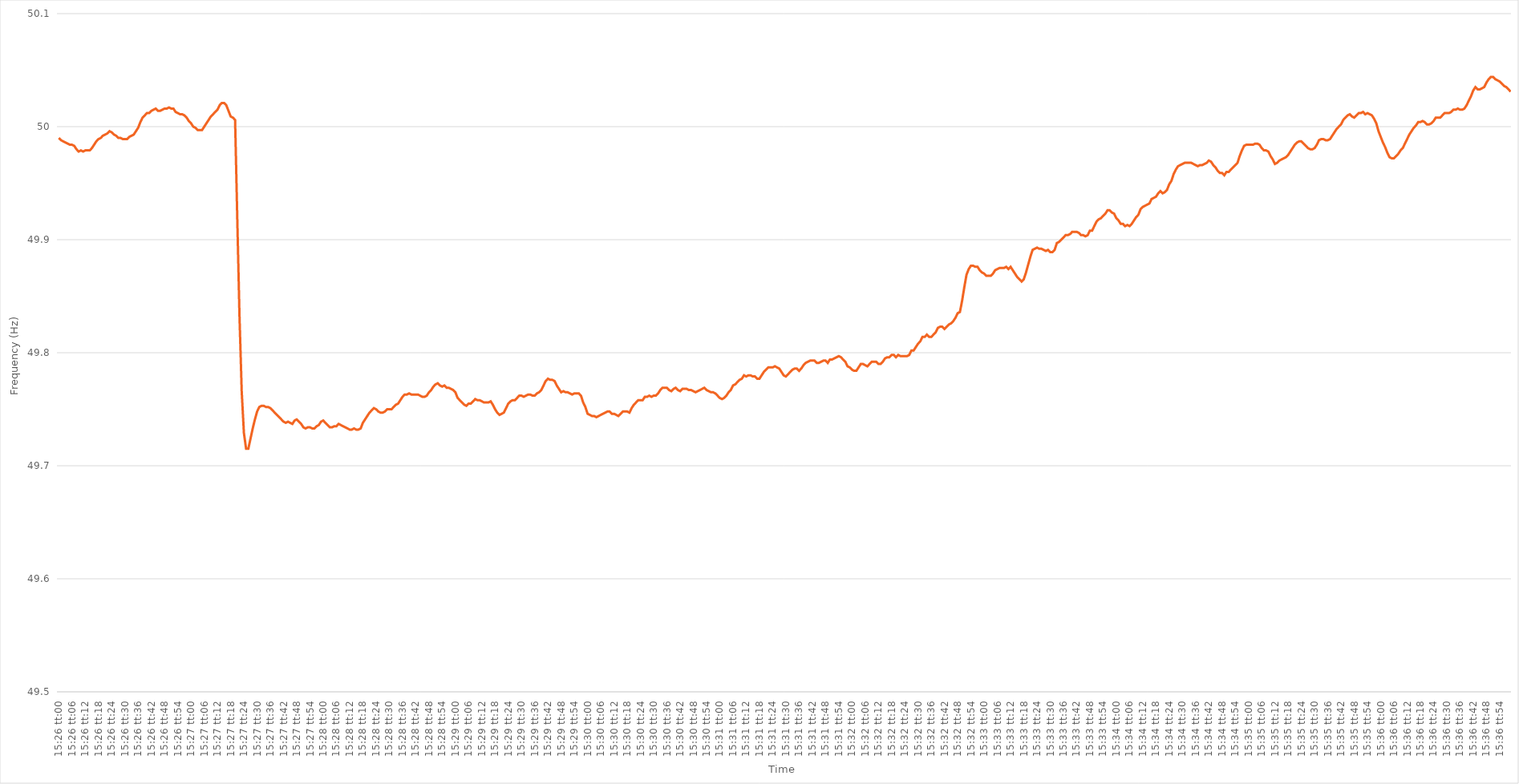
| Category | Series 0 |
|---|---|
| 0.6430555555555556 | 49.99 |
| 0.6430671296296296 | 49.988 |
| 0.6430787037037037 | 49.987 |
| 0.6430902777777777 | 49.986 |
| 0.6431018518518519 | 49.985 |
| 0.6431134259259259 | 49.984 |
| 0.6431250000000001 | 49.984 |
| 0.6431365740740741 | 49.983 |
| 0.6431481481481481 | 49.98 |
| 0.6431597222222222 | 49.978 |
| 0.6431712962962963 | 49.979 |
| 0.6431828703703704 | 49.978 |
| 0.6431944444444445 | 49.979 |
| 0.6432060185185186 | 49.979 |
| 0.6432175925925926 | 49.979 |
| 0.6432291666666666 | 49.981 |
| 0.6432407407407407 | 49.984 |
| 0.6432523148148148 | 49.987 |
| 0.6432638888888889 | 49.989 |
| 0.643275462962963 | 49.99 |
| 0.643287037037037 | 49.992 |
| 0.6432986111111111 | 49.993 |
| 0.6433101851851851 | 49.994 |
| 0.6433217592592593 | 49.996 |
| 0.6433333333333333 | 49.995 |
| 0.6433449074074075 | 49.993 |
| 0.6433564814814815 | 49.992 |
| 0.6433680555555555 | 49.99 |
| 0.6433796296296296 | 49.99 |
| 0.6433912037037037 | 49.989 |
| 0.6434027777777778 | 49.989 |
| 0.6434143518518519 | 49.989 |
| 0.643425925925926 | 49.991 |
| 0.6434375 | 49.992 |
| 0.643449074074074 | 49.993 |
| 0.6434606481481482 | 49.996 |
| 0.6434722222222222 | 49.999 |
| 0.6434837962962963 | 50.004 |
| 0.6434953703703704 | 50.008 |
| 0.6435069444444445 | 50.01 |
| 0.6435185185185185 | 50.012 |
| 0.6435300925925925 | 50.012 |
| 0.6435416666666667 | 50.014 |
| 0.6435532407407407 | 50.015 |
| 0.6435648148148149 | 50.016 |
| 0.6435763888888889 | 50.014 |
| 0.643587962962963 | 50.014 |
| 0.643599537037037 | 50.015 |
| 0.6436111111111111 | 50.016 |
| 0.6436226851851852 | 50.016 |
| 0.6436342592592593 | 50.017 |
| 0.6436458333333334 | 50.016 |
| 0.6436574074074074 | 50.016 |
| 0.6436689814814814 | 50.013 |
| 0.6436805555555556 | 50.012 |
| 0.6436921296296296 | 50.011 |
| 0.6437037037037037 | 50.011 |
| 0.6437152777777778 | 50.01 |
| 0.6437268518518519 | 50.008 |
| 0.6437384259259259 | 50.005 |
| 0.6437499999999999 | 50.003 |
| 0.6437615740740741 | 50 |
| 0.6437731481481481 | 49.999 |
| 0.6437847222222223 | 49.997 |
| 0.6437962962962963 | 49.997 |
| 0.6438078703703703 | 49.997 |
| 0.6438194444444444 | 50 |
| 0.6438310185185185 | 50.003 |
| 0.6438425925925926 | 50.006 |
| 0.6438541666666667 | 50.009 |
| 0.6438657407407408 | 50.011 |
| 0.6438773148148148 | 50.013 |
| 0.6438888888888888 | 50.015 |
| 0.643900462962963 | 50.019 |
| 0.643912037037037 | 50.021 |
| 0.6439236111111112 | 50.021 |
| 0.6439351851851852 | 50.019 |
| 0.6439467592592593 | 50.014 |
| 0.6439583333333333 | 50.009 |
| 0.6439699074074073 | 50.008 |
| 0.6439814814814815 | 50.006 |
| 0.6439930555555555 | 49.918 |
| 0.6440046296296297 | 49.832 |
| 0.6440162037037037 | 49.766 |
| 0.6440277777777778 | 49.729 |
| 0.6440393518518518 | 49.715 |
| 0.6440509259259259 | 49.715 |
| 0.6440625 | 49.724 |
| 0.6440740740740741 | 49.733 |
| 0.6440856481481482 | 49.741 |
| 0.6440972222222222 | 49.748 |
| 0.6441087962962962 | 49.752 |
| 0.6441203703703704 | 49.753 |
| 0.6441319444444444 | 49.753 |
| 0.6441435185185186 | 49.752 |
| 0.6441550925925926 | 49.752 |
| 0.6441666666666667 | 49.751 |
| 0.6441782407407407 | 49.749 |
| 0.6441898148148147 | 49.747 |
| 0.6442013888888889 | 49.745 |
| 0.6442129629629629 | 49.743 |
| 0.6442245370370371 | 49.741 |
| 0.6442361111111111 | 49.739 |
| 0.6442476851851852 | 49.738 |
| 0.6442592592592592 | 49.739 |
| 0.6442708333333333 | 49.738 |
| 0.6442824074074074 | 49.737 |
| 0.6442939814814815 | 49.74 |
| 0.6443055555555556 | 49.741 |
| 0.6443171296296296 | 49.739 |
| 0.6443287037037037 | 49.737 |
| 0.6443402777777778 | 49.734 |
| 0.6443518518518518 | 49.733 |
| 0.644363425925926 | 49.734 |
| 0.644375 | 49.734 |
| 0.6443865740740741 | 49.733 |
| 0.6443981481481481 | 49.733 |
| 0.6444097222222221 | 49.735 |
| 0.6444212962962963 | 49.736 |
| 0.6444328703703703 | 49.739 |
| 0.6444444444444445 | 49.74 |
| 0.6444560185185185 | 49.738 |
| 0.6444675925925926 | 49.736 |
| 0.6444791666666666 | 49.734 |
| 0.6444907407407408 | 49.734 |
| 0.6445023148148148 | 49.735 |
| 0.6445138888888889 | 49.735 |
| 0.644525462962963 | 49.737 |
| 0.644537037037037 | 49.736 |
| 0.6445486111111111 | 49.735 |
| 0.6445601851851852 | 49.734 |
| 0.6445717592592592 | 49.733 |
| 0.6445833333333334 | 49.732 |
| 0.6445949074074074 | 49.732 |
| 0.6446064814814815 | 49.733 |
| 0.6446180555555555 | 49.732 |
| 0.6446296296296297 | 49.732 |
| 0.6446412037037037 | 49.733 |
| 0.6446527777777779 | 49.738 |
| 0.6446643518518519 | 49.741 |
| 0.6446759259259259 | 49.744 |
| 0.6446875 | 49.747 |
| 0.644699074074074 | 49.749 |
| 0.6447106481481482 | 49.751 |
| 0.6447222222222222 | 49.75 |
| 0.6447337962962963 | 49.748 |
| 0.6447453703703704 | 49.747 |
| 0.6447569444444444 | 49.747 |
| 0.6447685185185185 | 49.748 |
| 0.6447800925925926 | 49.75 |
| 0.6447916666666667 | 49.75 |
| 0.6448032407407408 | 49.75 |
| 0.6448148148148148 | 49.752 |
| 0.6448263888888889 | 49.754 |
| 0.6448379629629629 | 49.755 |
| 0.6448495370370371 | 49.758 |
| 0.6448611111111111 | 49.761 |
| 0.6448726851851853 | 49.763 |
| 0.6448842592592593 | 49.763 |
| 0.6448958333333333 | 49.764 |
| 0.6449074074074074 | 49.763 |
| 0.6449189814814814 | 49.763 |
| 0.6449305555555556 | 49.763 |
| 0.6449421296296296 | 49.763 |
| 0.6449537037037038 | 49.762 |
| 0.6449652777777778 | 49.761 |
| 0.6449768518518518 | 49.761 |
| 0.6449884259259259 | 49.762 |
| 0.645 | 49.765 |
| 0.6450115740740741 | 49.767 |
| 0.6450231481481482 | 49.77 |
| 0.6450347222222222 | 49.772 |
| 0.6450462962962963 | 49.773 |
| 0.6450578703703703 | 49.771 |
| 0.6450694444444445 | 49.77 |
| 0.6450810185185185 | 49.771 |
| 0.6450925925925927 | 49.769 |
| 0.6451041666666667 | 49.769 |
| 0.6451157407407407 | 49.768 |
| 0.6451273148148148 | 49.767 |
| 0.6451388888888888 | 49.765 |
| 0.645150462962963 | 49.76 |
| 0.645162037037037 | 49.758 |
| 0.6451736111111112 | 49.756 |
| 0.6451851851851852 | 49.754 |
| 0.6451967592592592 | 49.753 |
| 0.6452083333333333 | 49.755 |
| 0.6452199074074074 | 49.755 |
| 0.6452314814814815 | 49.757 |
| 0.6452430555555556 | 49.759 |
| 0.6452546296296297 | 49.758 |
| 0.6452662037037037 | 49.758 |
| 0.6452777777777777 | 49.757 |
| 0.6452893518518519 | 49.756 |
| 0.6453009259259259 | 49.756 |
| 0.6453125000000001 | 49.756 |
| 0.6453240740740741 | 49.757 |
| 0.6453356481481481 | 49.754 |
| 0.6453472222222222 | 49.75 |
| 0.6453587962962963 | 49.747 |
| 0.6453703703703704 | 49.745 |
| 0.6453819444444444 | 49.746 |
| 0.6453935185185186 | 49.747 |
| 0.6454050925925926 | 49.751 |
| 0.6454166666666666 | 49.755 |
| 0.6454282407407407 | 49.757 |
| 0.6454398148148148 | 49.758 |
| 0.6454513888888889 | 49.758 |
| 0.645462962962963 | 49.76 |
| 0.645474537037037 | 49.762 |
| 0.6454861111111111 | 49.762 |
| 0.6454976851851851 | 49.761 |
| 0.6455092592592593 | 49.762 |
| 0.6455208333333333 | 49.763 |
| 0.6455324074074075 | 49.763 |
| 0.6455439814814815 | 49.762 |
| 0.6455555555555555 | 49.762 |
| 0.6455671296296296 | 49.764 |
| 0.6455787037037037 | 49.765 |
| 0.6455902777777778 | 49.767 |
| 0.6456018518518518 | 49.771 |
| 0.645613425925926 | 49.775 |
| 0.645625 | 49.777 |
| 0.645636574074074 | 49.776 |
| 0.6456481481481481 | 49.776 |
| 0.6456597222222222 | 49.775 |
| 0.6456712962962963 | 49.771 |
| 0.6456828703703704 | 49.768 |
| 0.6456944444444445 | 49.765 |
| 0.6457060185185185 | 49.766 |
| 0.6457175925925925 | 49.765 |
| 0.6457291666666667 | 49.765 |
| 0.6457407407407407 | 49.764 |
| 0.6457523148148149 | 49.763 |
| 0.6457638888888889 | 49.764 |
| 0.645775462962963 | 49.764 |
| 0.645787037037037 | 49.764 |
| 0.6457986111111111 | 49.762 |
| 0.6458101851851852 | 49.756 |
| 0.6458217592592593 | 49.752 |
| 0.6458333333333334 | 49.746 |
| 0.6458449074074074 | 49.745 |
| 0.6458564814814814 | 49.744 |
| 0.6458680555555555 | 49.744 |
| 0.6458796296296296 | 49.743 |
| 0.6458912037037037 | 49.744 |
| 0.6459027777777778 | 49.745 |
| 0.6459143518518519 | 49.746 |
| 0.6459259259259259 | 49.747 |
| 0.6459374999999999 | 49.748 |
| 0.6459490740740741 | 49.748 |
| 0.6459606481481481 | 49.746 |
| 0.6459722222222223 | 49.746 |
| 0.6459837962962963 | 49.745 |
| 0.6459953703703704 | 49.744 |
| 0.6460069444444444 | 49.746 |
| 0.6460185185185185 | 49.748 |
| 0.6460300925925926 | 49.748 |
| 0.6460416666666667 | 49.748 |
| 0.6460532407407408 | 49.747 |
| 0.6460648148148148 | 49.751 |
| 0.6460763888888889 | 49.754 |
| 0.6460879629629629 | 49.756 |
| 0.646099537037037 | 49.758 |
| 0.6461111111111111 | 49.758 |
| 0.6461226851851852 | 49.758 |
| 0.6461342592592593 | 49.761 |
| 0.6461458333333333 | 49.761 |
| 0.6461574074074073 | 49.762 |
| 0.6461689814814815 | 49.761 |
| 0.6461805555555555 | 49.762 |
| 0.6461921296296297 | 49.762 |
| 0.6462037037037037 | 49.764 |
| 0.6462152777777778 | 49.767 |
| 0.6462268518518518 | 49.769 |
| 0.646238425925926 | 49.769 |
| 0.64625 | 49.769 |
| 0.6462615740740741 | 49.767 |
| 0.6462731481481482 | 49.766 |
| 0.6462847222222222 | 49.768 |
| 0.6462962962962963 | 49.769 |
| 0.6463078703703703 | 49.767 |
| 0.6463194444444444 | 49.766 |
| 0.6463310185185185 | 49.768 |
| 0.6463425925925926 | 49.768 |
| 0.6463541666666667 | 49.768 |
| 0.6463657407407407 | 49.767 |
| 0.6463773148148148 | 49.767 |
| 0.6463888888888889 | 49.766 |
| 0.6464004629629629 | 49.765 |
| 0.6464120370370371 | 49.766 |
| 0.6464236111111111 | 49.767 |
| 0.6464351851851852 | 49.768 |
| 0.6464467592592592 | 49.769 |
| 0.6464583333333334 | 49.767 |
| 0.6464699074074074 | 49.766 |
| 0.6464814814814815 | 49.765 |
| 0.6464930555555556 | 49.765 |
| 0.6465046296296296 | 49.764 |
| 0.6465162037037037 | 49.762 |
| 0.6465277777777778 | 49.76 |
| 0.6465393518518519 | 49.759 |
| 0.646550925925926 | 49.76 |
| 0.6465625 | 49.762 |
| 0.6465740740740741 | 49.765 |
| 0.6465856481481481 | 49.767 |
| 0.6465972222222222 | 49.771 |
| 0.6466087962962963 | 49.772 |
| 0.6466203703703703 | 49.774 |
| 0.6466319444444445 | 49.776 |
| 0.6466435185185185 | 49.777 |
| 0.6466550925925926 | 49.78 |
| 0.6466666666666666 | 49.779 |
| 0.6466782407407408 | 49.78 |
| 0.6466898148148148 | 49.78 |
| 0.646701388888889 | 49.779 |
| 0.646712962962963 | 49.779 |
| 0.646724537037037 | 49.777 |
| 0.6467361111111111 | 49.777 |
| 0.6467476851851852 | 49.78 |
| 0.6467592592592593 | 49.783 |
| 0.6467708333333334 | 49.785 |
| 0.6467824074074074 | 49.787 |
| 0.6467939814814815 | 49.787 |
| 0.6468055555555555 | 49.787 |
| 0.6468171296296296 | 49.788 |
| 0.6468287037037037 | 49.787 |
| 0.6468402777777778 | 49.786 |
| 0.6468518518518519 | 49.783 |
| 0.6468634259259259 | 49.78 |
| 0.646875 | 49.779 |
| 0.646886574074074 | 49.781 |
| 0.6468981481481482 | 49.783 |
| 0.6469097222222222 | 49.785 |
| 0.6469212962962964 | 49.786 |
| 0.6469328703703704 | 49.786 |
| 0.6469444444444444 | 49.784 |
| 0.6469560185185185 | 49.786 |
| 0.6469675925925926 | 49.789 |
| 0.6469791666666667 | 49.791 |
| 0.6469907407407408 | 49.792 |
| 0.6470023148148148 | 49.793 |
| 0.6470138888888889 | 49.793 |
| 0.6470254629629629 | 49.793 |
| 0.647037037037037 | 49.791 |
| 0.6470486111111111 | 49.791 |
| 0.6470601851851852 | 49.792 |
| 0.6470717592592593 | 49.793 |
| 0.6470833333333333 | 49.793 |
| 0.6470949074074074 | 49.791 |
| 0.6471064814814814 | 49.794 |
| 0.6471180555555556 | 49.794 |
| 0.6471296296296296 | 49.795 |
| 0.6471412037037038 | 49.796 |
| 0.6471527777777778 | 49.797 |
| 0.6471643518518518 | 49.796 |
| 0.6471759259259259 | 49.794 |
| 0.6471875 | 49.792 |
| 0.6471990740740741 | 49.788 |
| 0.6472106481481482 | 49.787 |
| 0.6472222222222223 | 49.785 |
| 0.6472337962962963 | 49.784 |
| 0.6472453703703703 | 49.784 |
| 0.6472569444444444 | 49.787 |
| 0.6472685185185185 | 49.79 |
| 0.6472800925925926 | 49.79 |
| 0.6472916666666667 | 49.789 |
| 0.6473032407407407 | 49.788 |
| 0.6473148148148148 | 49.79 |
| 0.6473263888888888 | 49.792 |
| 0.647337962962963 | 49.792 |
| 0.647349537037037 | 49.792 |
| 0.6473611111111112 | 49.79 |
| 0.6473726851851852 | 49.79 |
| 0.6473842592592592 | 49.792 |
| 0.6473958333333333 | 49.795 |
| 0.6474074074074074 | 49.796 |
| 0.6474189814814815 | 49.796 |
| 0.6474305555555556 | 49.798 |
| 0.6474421296296297 | 49.798 |
| 0.6474537037037037 | 49.796 |
| 0.6474652777777777 | 49.798 |
| 0.6474768518518519 | 49.797 |
| 0.6474884259259259 | 49.797 |
| 0.6475 | 49.797 |
| 0.6475115740740741 | 49.797 |
| 0.6475231481481482 | 49.798 |
| 0.6475347222222222 | 49.802 |
| 0.6475462962962962 | 49.802 |
| 0.6475578703703704 | 49.805 |
| 0.6475694444444444 | 49.808 |
| 0.6475810185185186 | 49.81 |
| 0.6475925925925926 | 49.814 |
| 0.6476041666666666 | 49.814 |
| 0.6476157407407407 | 49.816 |
| 0.6476273148148148 | 49.814 |
| 0.6476388888888889 | 49.814 |
| 0.647650462962963 | 49.816 |
| 0.6476620370370371 | 49.818 |
| 0.6476736111111111 | 49.822 |
| 0.6476851851851851 | 49.823 |
| 0.6476967592592593 | 49.823 |
| 0.6477083333333333 | 49.821 |
| 0.6477199074074075 | 49.823 |
| 0.6477314814814815 | 49.825 |
| 0.6477430555555556 | 49.826 |
| 0.6477546296296296 | 49.828 |
| 0.6477662037037036 | 49.831 |
| 0.6477777777777778 | 49.835 |
| 0.6477893518518518 | 49.836 |
| 0.647800925925926 | 49.846 |
| 0.6478125 | 49.858 |
| 0.647824074074074 | 49.869 |
| 0.6478356481481481 | 49.874 |
| 0.6478472222222222 | 49.877 |
| 0.6478587962962963 | 49.877 |
| 0.6478703703703704 | 49.876 |
| 0.6478819444444445 | 49.876 |
| 0.6478935185185185 | 49.873 |
| 0.6479050925925925 | 49.871 |
| 0.6479166666666667 | 49.87 |
| 0.6479282407407407 | 49.868 |
| 0.6479398148148149 | 49.868 |
| 0.6479513888888889 | 49.868 |
| 0.647962962962963 | 49.87 |
| 0.647974537037037 | 49.873 |
| 0.647986111111111 | 49.874 |
| 0.6479976851851852 | 49.875 |
| 0.6480092592592592 | 49.875 |
| 0.6480208333333334 | 49.875 |
| 0.6480324074074074 | 49.876 |
| 0.6480439814814815 | 49.874 |
| 0.6480555555555555 | 49.876 |
| 0.6480671296296296 | 49.873 |
| 0.6480787037037037 | 49.87 |
| 0.6480902777777778 | 49.867 |
| 0.6481018518518519 | 49.865 |
| 0.6481134259259259 | 49.863 |
| 0.648125 | 49.865 |
| 0.6481365740740741 | 49.871 |
| 0.6481481481481481 | 49.878 |
| 0.6481597222222223 | 49.885 |
| 0.6481712962962963 | 49.891 |
| 0.6481828703703704 | 49.892 |
| 0.6481944444444444 | 49.893 |
| 0.6482060185185184 | 49.892 |
| 0.6482175925925926 | 49.892 |
| 0.6482291666666666 | 49.891 |
| 0.6482407407407408 | 49.89 |
| 0.6482523148148148 | 49.891 |
| 0.6482638888888889 | 49.889 |
| 0.6482754629629629 | 49.889 |
| 0.648287037037037 | 49.891 |
| 0.6482986111111111 | 49.897 |
| 0.6483101851851852 | 49.898 |
| 0.6483217592592593 | 49.9 |
| 0.6483333333333333 | 49.902 |
| 0.6483449074074074 | 49.904 |
| 0.6483564814814815 | 49.904 |
| 0.6483680555555555 | 49.905 |
| 0.6483796296296297 | 49.907 |
| 0.6483912037037037 | 49.907 |
| 0.6484027777777778 | 49.907 |
| 0.6484143518518518 | 49.906 |
| 0.648425925925926 | 49.904 |
| 0.6484375 | 49.904 |
| 0.648449074074074 | 49.903 |
| 0.6484606481481482 | 49.904 |
| 0.6484722222222222 | 49.908 |
| 0.6484837962962963 | 49.908 |
| 0.6484953703703703 | 49.912 |
| 0.6485069444444445 | 49.916 |
| 0.6485185185185185 | 49.918 |
| 0.6485300925925926 | 49.919 |
| 0.6485416666666667 | 49.921 |
| 0.6485532407407407 | 49.923 |
| 0.6485648148148148 | 49.926 |
| 0.6485763888888889 | 49.926 |
| 0.648587962962963 | 49.924 |
| 0.6485995370370371 | 49.923 |
| 0.6486111111111111 | 49.919 |
| 0.6486226851851852 | 49.917 |
| 0.6486342592592592 | 49.914 |
| 0.6486458333333334 | 49.914 |
| 0.6486574074074074 | 49.912 |
| 0.6486689814814816 | 49.913 |
| 0.6486805555555556 | 49.912 |
| 0.6486921296296296 | 49.914 |
| 0.6487037037037037 | 49.917 |
| 0.6487152777777777 | 49.92 |
| 0.6487268518518519 | 49.922 |
| 0.6487384259259259 | 49.927 |
| 0.64875 | 49.929 |
| 0.6487615740740741 | 49.93 |
| 0.6487731481481481 | 49.931 |
| 0.6487847222222222 | 49.932 |
| 0.6487962962962963 | 49.936 |
| 0.6488078703703704 | 49.937 |
| 0.6488194444444445 | 49.938 |
| 0.6488310185185185 | 49.941 |
| 0.6488425925925926 | 49.943 |
| 0.6488541666666666 | 49.941 |
| 0.6488657407407408 | 49.942 |
| 0.6488773148148148 | 49.944 |
| 0.648888888888889 | 49.949 |
| 0.648900462962963 | 49.952 |
| 0.648912037037037 | 49.958 |
| 0.6489236111111111 | 49.962 |
| 0.6489351851851851 | 49.965 |
| 0.6489467592592593 | 49.966 |
| 0.6489583333333333 | 49.967 |
| 0.6489699074074075 | 49.968 |
| 0.6489814814814815 | 49.968 |
| 0.6489930555555555 | 49.968 |
| 0.6490046296296296 | 49.968 |
| 0.6490162037037037 | 49.967 |
| 0.6490277777777778 | 49.966 |
| 0.6490393518518519 | 49.965 |
| 0.649050925925926 | 49.966 |
| 0.6490625 | 49.966 |
| 0.649074074074074 | 49.967 |
| 0.6490856481481482 | 49.968 |
| 0.6490972222222222 | 49.97 |
| 0.6491087962962964 | 49.969 |
| 0.6491203703703704 | 49.966 |
| 0.6491319444444444 | 49.964 |
| 0.6491435185185185 | 49.961 |
| 0.6491550925925925 | 49.959 |
| 0.6491666666666667 | 49.959 |
| 0.6491782407407407 | 49.957 |
| 0.6491898148148149 | 49.96 |
| 0.6492013888888889 | 49.96 |
| 0.6492129629629629 | 49.962 |
| 0.649224537037037 | 49.964 |
| 0.6492361111111111 | 49.966 |
| 0.6492476851851852 | 49.968 |
| 0.6492592592592593 | 49.974 |
| 0.6492708333333334 | 49.979 |
| 0.6492824074074074 | 49.983 |
| 0.6492939814814814 | 49.984 |
| 0.6493055555555556 | 49.984 |
| 0.6493171296296296 | 49.984 |
| 0.6493287037037038 | 49.984 |
| 0.6493402777777778 | 49.985 |
| 0.6493518518518518 | 49.985 |
| 0.6493634259259259 | 49.984 |
| 0.649375 | 49.981 |
| 0.6493865740740741 | 49.979 |
| 0.6493981481481481 | 49.979 |
| 0.6494097222222223 | 49.978 |
| 0.6494212962962963 | 49.974 |
| 0.6494328703703703 | 49.971 |
| 0.6494444444444444 | 49.967 |
| 0.6494560185185185 | 49.968 |
| 0.6494675925925926 | 49.97 |
| 0.6494791666666667 | 49.971 |
| 0.6494907407407408 | 49.972 |
| 0.6495023148148148 | 49.973 |
| 0.6495138888888888 | 49.975 |
| 0.649525462962963 | 49.978 |
| 0.649537037037037 | 49.981 |
| 0.6495486111111112 | 49.984 |
| 0.6495601851851852 | 49.986 |
| 0.6495717592592593 | 49.987 |
| 0.6495833333333333 | 49.987 |
| 0.6495949074074074 | 49.985 |
| 0.6496064814814815 | 49.983 |
| 0.6496180555555556 | 49.981 |
| 0.6496296296296297 | 49.98 |
| 0.6496412037037037 | 49.98 |
| 0.6496527777777777 | 49.981 |
| 0.6496643518518518 | 49.984 |
| 0.6496759259259259 | 49.988 |
| 0.6496875 | 49.989 |
| 0.6496990740740741 | 49.989 |
| 0.6497106481481482 | 49.988 |
| 0.6497222222222222 | 49.988 |
| 0.6497337962962962 | 49.989 |
| 0.6497453703703704 | 49.992 |
| 0.6497569444444444 | 49.995 |
| 0.6497685185185186 | 49.998 |
| 0.6497800925925926 | 50 |
| 0.6497916666666667 | 50.002 |
| 0.6498032407407407 | 50.006 |
| 0.6498148148148148 | 50.008 |
| 0.6498263888888889 | 50.01 |
| 0.649837962962963 | 50.011 |
| 0.6498495370370371 | 50.009 |
| 0.6498611111111111 | 50.008 |
| 0.6498726851851852 | 50.01 |
| 0.6498842592592592 | 50.012 |
| 0.6498958333333333 | 50.012 |
| 0.6499074074074074 | 50.013 |
| 0.6499189814814815 | 50.011 |
| 0.6499305555555556 | 50.012 |
| 0.6499421296296296 | 50.011 |
| 0.6499537037037036 | 50.01 |
| 0.6499652777777778 | 50.007 |
| 0.6499768518518518 | 50.003 |
| 0.649988425925926 | 49.996 |
| 0.65 | 49.991 |
| 0.6500115740740741 | 49.986 |
| 0.6500231481481481 | 49.982 |
| 0.6500347222222222 | 49.977 |
| 0.6500462962962963 | 49.973 |
| 0.6500578703703704 | 49.972 |
| 0.6500694444444445 | 49.972 |
| 0.6500810185185185 | 49.974 |
| 0.6500925925925926 | 49.976 |
| 0.6501041666666666 | 49.979 |
| 0.6501157407407407 | 49.981 |
| 0.6501273148148148 | 49.985 |
| 0.6501388888888889 | 49.989 |
| 0.650150462962963 | 49.993 |
| 0.650162037037037 | 49.996 |
| 0.650173611111111 | 49.999 |
| 0.6501851851851852 | 50.001 |
| 0.6501967592592592 | 50.004 |
| 0.6502083333333334 | 50.004 |
| 0.6502199074074074 | 50.005 |
| 0.6502314814814815 | 50.004 |
| 0.6502430555555555 | 50.002 |
| 0.6502546296296297 | 50.002 |
| 0.6502662037037037 | 50.003 |
| 0.6502777777777778 | 50.005 |
| 0.6502893518518519 | 50.008 |
| 0.6503009259259259 | 50.008 |
| 0.6503125 | 50.008 |
| 0.6503240740740741 | 50.01 |
| 0.6503356481481481 | 50.012 |
| 0.6503472222222222 | 50.012 |
| 0.6503587962962963 | 50.012 |
| 0.6503703703703704 | 50.013 |
| 0.6503819444444444 | 50.015 |
| 0.6503935185185185 | 50.015 |
| 0.6504050925925926 | 50.016 |
| 0.6504166666666666 | 50.015 |
| 0.6504282407407408 | 50.015 |
| 0.6504398148148148 | 50.016 |
| 0.6504513888888889 | 50.019 |
| 0.6504629629629629 | 50.023 |
| 0.6504745370370371 | 50.027 |
| 0.6504861111111111 | 50.032 |
| 0.6504976851851852 | 50.035 |
| 0.6505092592592593 | 50.033 |
| 0.6505208333333333 | 50.033 |
| 0.6505324074074074 | 50.034 |
| 0.6505439814814815 | 50.035 |
| 0.6505555555555556 | 50.039 |
| 0.6505671296296297 | 50.042 |
| 0.6505787037037037 | 50.044 |
| 0.6505902777777778 | 50.044 |
| 0.6506018518518518 | 50.042 |
| 0.6506134259259259 | 50.041 |
| 0.650625 | 50.04 |
| 0.650636574074074 | 50.038 |
| 0.6506481481481482 | 50.036 |
| 0.6506597222222222 | 50.035 |
| 0.6506712962962963 | 50.033 |
| 0.6506828703703703 | 50.031 |